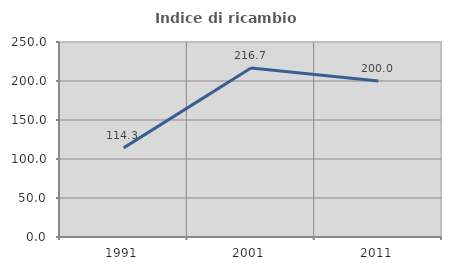
| Category | Indice di ricambio occupazionale  |
|---|---|
| 1991.0 | 114.286 |
| 2001.0 | 216.667 |
| 2011.0 | 200 |